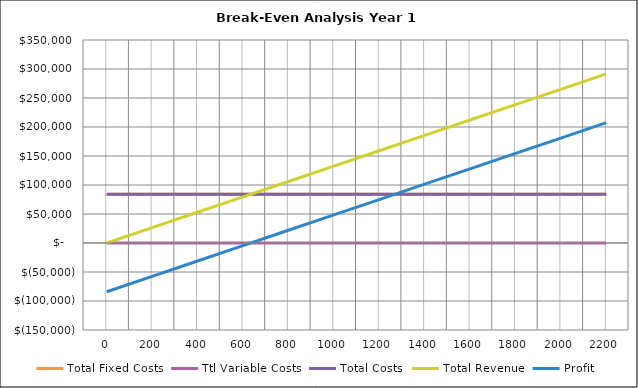
| Category | Total Fixed Costs | Ttl Variable Costs | Total Costs | Total Revenue | Profit |
|---|---|---|---|---|---|
| 0.0 | 84087.814 | 0 | 84087.814 | 0 | -84087.814 |
| 200.0 | 84087.814 | 0 | 84087.814 | 26500 | -57587.814 |
| 400.0 | 84087.814 | 0 | 84087.814 | 53000 | -31087.814 |
| 600.0 | 84087.814 | 0 | 84087.814 | 79500 | -4587.814 |
| 800.0 | 84087.814 | 0 | 84087.814 | 106000 | 21912.186 |
| 1000.0 | 84087.814 | 0 | 84087.814 | 132500 | 48412.186 |
| 1200.0 | 84087.814 | 0 | 84087.814 | 159000 | 74912.186 |
| 1400.0 | 84087.814 | 0 | 84087.814 | 185500 | 101412.186 |
| 1600.0 | 84087.814 | 0 | 84087.814 | 212000 | 127912.186 |
| 1800.0 | 84087.814 | 0 | 84087.814 | 238500 | 154412.186 |
| 2000.0 | 84087.814 | 0 | 84087.814 | 265000 | 180912.186 |
| 2200.0 | 84087.814 | 0 | 84087.814 | 291500 | 207412.186 |